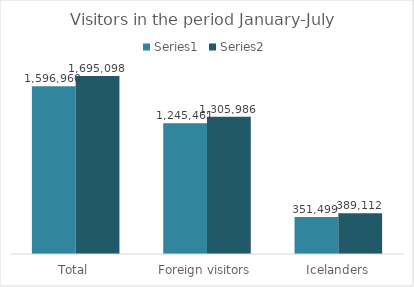
| Category | Series 0 | Series 1 |
|---|---|---|
| Total | 1596960 | 1695098 |
| Foreign visitors | 1245461 | 1305986 |
| Icelanders | 351499 | 389112 |